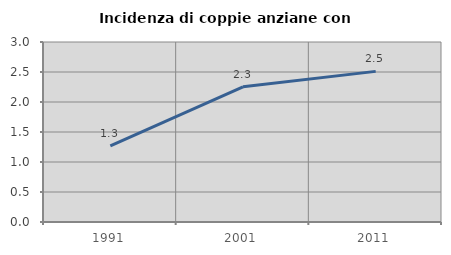
| Category | Incidenza di coppie anziane con figli |
|---|---|
| 1991.0 | 1.267 |
| 2001.0 | 2.253 |
| 2011.0 | 2.51 |